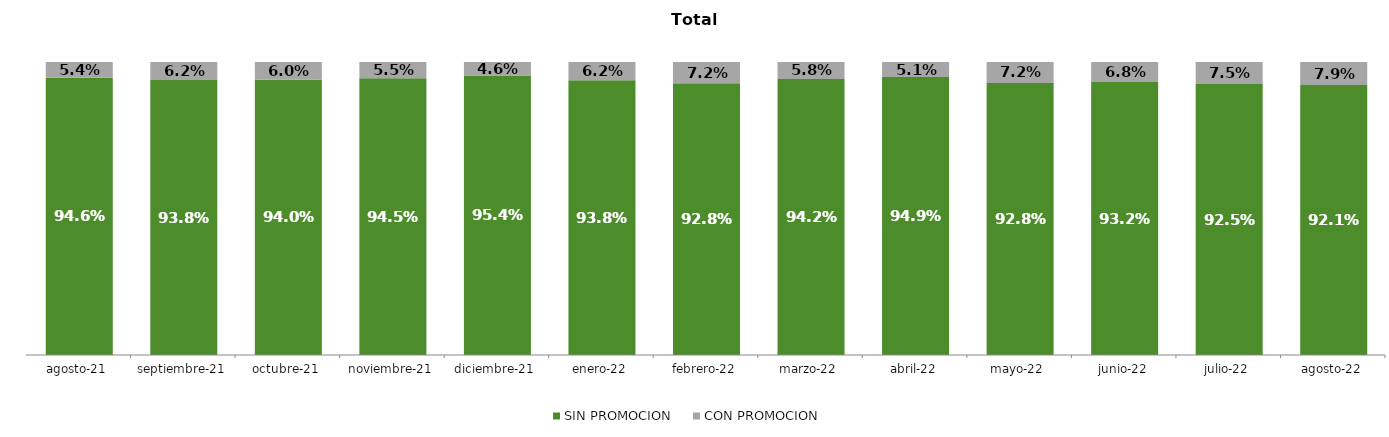
| Category | SIN PROMOCION   | CON PROMOCION   |
|---|---|---|
| 2021-08-01 | 0.946 | 0.054 |
| 2021-09-01 | 0.938 | 0.062 |
| 2021-10-01 | 0.94 | 0.06 |
| 2021-11-01 | 0.945 | 0.055 |
| 2021-12-01 | 0.954 | 0.046 |
| 2022-01-01 | 0.938 | 0.062 |
| 2022-02-01 | 0.928 | 0.072 |
| 2022-03-01 | 0.942 | 0.058 |
| 2022-04-01 | 0.949 | 0.051 |
| 2022-05-01 | 0.928 | 0.072 |
| 2022-06-01 | 0.932 | 0.068 |
| 2022-07-01 | 0.925 | 0.075 |
| 2022-08-01 | 0.921 | 0.079 |